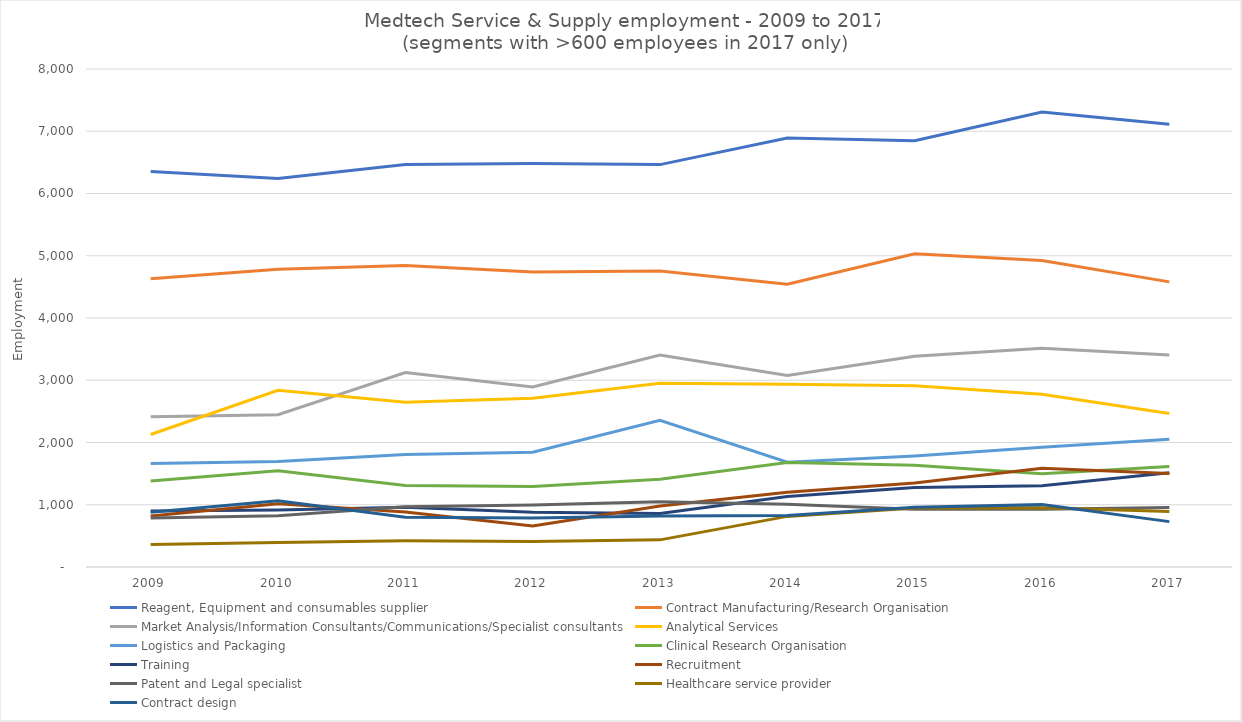
| Category | Reagent, Equipment and consumables supplier | Contract Manufacturing/Research Organisation | Market Analysis/Information Consultants/Communications/Specialist consultants | Analytical Services | Logistics and Packaging | Clinical Research Organisation | Training | Recruitment | Patent and Legal specialist | Healthcare service provider | Contract design |
|---|---|---|---|---|---|---|---|---|---|---|---|
| 2009 | 6355 | 4630 | 2413 | 2129 | 1664 | 1381 | 898 | 818 | 787 | 362 | 881 |
| 2010 | 6241 | 4782 | 2447 | 2840 | 1695 | 1547 | 915 | 1017 | 825 | 393 | 1065 |
| 2011 | 6466 | 4844 | 3125 | 2647 | 1809 | 1310 | 960 | 882 | 968 | 422 | 799 |
| 2012 | 6482 | 4737 | 2891 | 2711 | 1844 | 1294 | 880 | 659 | 996 | 409 | 789 |
| 2013 | 6464 | 4756 | 3405 | 2952 | 2358 | 1411 | 861 | 980 | 1049 | 436 | 819 |
| 2014 | 6892 | 4542 | 3075 | 2935 | 1683 | 1677 | 1131 | 1201 | 1007 | 813 | 827 |
| 2015 | 6848 | 5032 | 3386 | 2913 | 1783 | 1634 | 1276 | 1351 | 927 | 946 | 959 |
| 2016 | 7310 | 4923 | 3513 | 2775 | 1924 | 1499 | 1306 | 1585 | 926 | 951 | 1002 |
| 2017 | 7112 | 4580 | 3407 | 2467 | 2052 | 1614 | 1515 | 1503 | 957 | 890 | 729 |